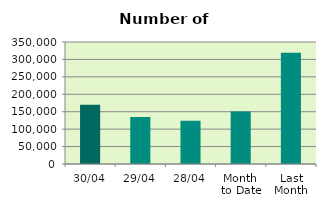
| Category | Series 0 |
|---|---|
| 30/04 | 170218 |
| 29/04 | 134532 |
| 28/04 | 123988 |
| Month 
to Date | 150855.6 |
| Last
Month | 318803.545 |